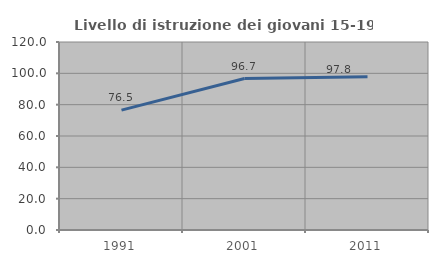
| Category | Livello di istruzione dei giovani 15-19 anni |
|---|---|
| 1991.0 | 76.511 |
| 2001.0 | 96.654 |
| 2011.0 | 97.763 |